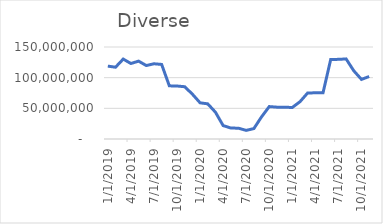
| Category | Diverse |
|---|---|
| 1/1/19 | 118833333.333 |
| 2/1/19 | 117041666.667 |
| 3/1/19 | 130312500 |
| 4/1/19 | 123079166.667 |
| 5/1/19 | 126950000 |
| 6/1/19 | 119770833.333 |
| 7/1/19 | 122658333.333 |
| 8/1/19 | 121595833.333 |
| 9/1/19 | 86675000 |
| 10/1/19 | 86395833.333 |
| 11/1/19 | 85225000 |
| 12/1/19 | 73116666.667 |
| 1/1/20 | 59037500 |
| 2/1/20 | 57287500 |
| 3/1/20 | 43695833.333 |
| 4/1/20 | 21887500 |
| 5/1/20 | 17908333.333 |
| 6/1/20 | 17595833.333 |
| 7/1/20 | 14054166.667 |
| 8/1/20 | 16983333.333 |
| 9/1/20 | 36154166.667 |
| 10/1/20 | 52879166.667 |
| 11/1/20 | 51900000 |
| 12/1/20 | 51825000 |
| 1/1/21 | 51366666.667 |
| 2/1/21 | 60783333.333 |
| 3/1/21 | 75106666.667 |
| 4/1/21 | 75260833.333 |
| 5/1/21 | 75435833.333 |
| 6/1/21 | 129748333.333 |
| 7/1/21 | 129831666.667 |
| 8/1/21 | 130594166.667 |
| 9/1/21 | 111190000 |
| 10/1/21 | 97169166.667 |
| 11/1/21 | 101902500 |